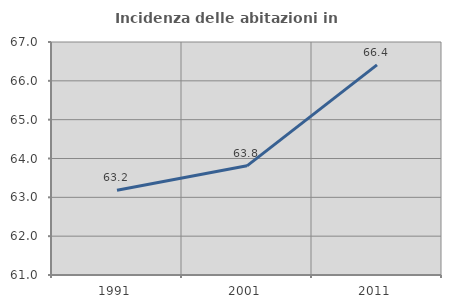
| Category | Incidenza delle abitazioni in proprietà  |
|---|---|
| 1991.0 | 63.181 |
| 2001.0 | 63.812 |
| 2011.0 | 66.411 |